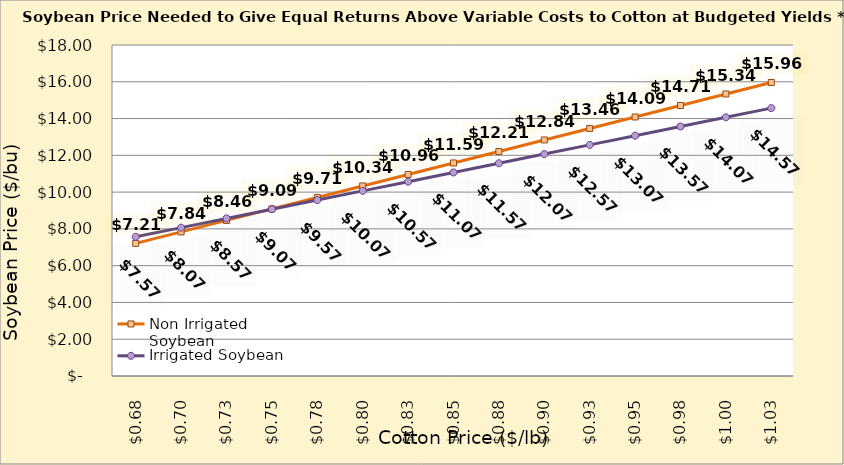
| Category | Non Irrigated Soybean | Irrigated Soybean |
|---|---|---|
| 0.6749999999999998 | 7.211 | 7.568 |
| 0.6999999999999998 | 7.836 | 8.068 |
| 0.7249999999999999 | 8.461 | 8.568 |
| 0.7499999999999999 | 9.086 | 9.068 |
| 0.7749999999999999 | 9.711 | 9.568 |
| 0.7999999999999999 | 10.336 | 10.068 |
| 0.825 | 10.961 | 10.568 |
| 0.85 | 11.586 | 11.068 |
| 0.875 | 12.211 | 11.568 |
| 0.9 | 12.836 | 12.068 |
| 0.925 | 13.461 | 12.568 |
| 0.9500000000000001 | 14.086 | 13.068 |
| 0.9750000000000001 | 14.711 | 13.568 |
| 1.0 | 15.336 | 14.068 |
| 1.025 | 15.961 | 14.568 |